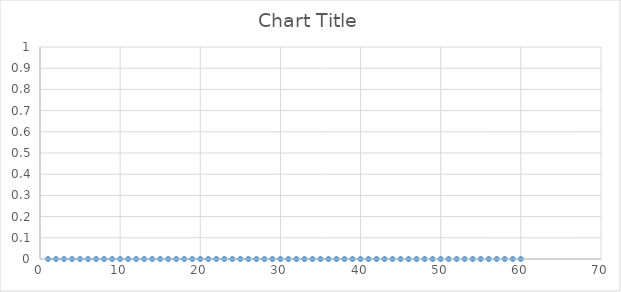
| Category | Series 0 |
|---|---|
| 0.0 | 0 |
| 0.0 | 0 |
| 0.0 | 0 |
| 0.0 | 0 |
| 0.0 | 0 |
| 0.0 | 0 |
| 0.0 | 0 |
| 0.0 | 0 |
| 0.0 | 0 |
| 0.0 | 0 |
| 0.0 | 0 |
| 0.0 | 0 |
| 0.0 | 0 |
| 0.0 | 0 |
| 0.0 | 0 |
| 0.0 | 0 |
| 0.0 | 0 |
| 0.0 | 0 |
| 0.0 | 0 |
| 0.0 | 0 |
| 0.0 | 0 |
| 0.0 | 0 |
| 0.0 | 0 |
| 0.0 | 0 |
| 0.0 | 0 |
| 0.0 | 0 |
| 0.0 | 0 |
| 0.0 | 0 |
| 0.0 | 0 |
| 0.0 | 0 |
| 0.0 | 0 |
| 0.0 | 0 |
| 0.0 | 0 |
| 0.0 | 0 |
| 0.0 | 0 |
| 0.0 | 0 |
| 0.0 | 0 |
| 0.0 | 0 |
| 0.0 | 0 |
| 0.0 | 0 |
| 0.0 | 0 |
| 0.0 | 0 |
| 0.0 | 0 |
| 0.0 | 0 |
| 0.0 | 0 |
| 0.0 | 0 |
| 0.0 | 0 |
| 0.0 | 0 |
| 0.0 | 0 |
| 0.0 | 0 |
| 0.0 | 0 |
| 0.0 | 0 |
| 0.0 | 0 |
| 0.0 | 0 |
| 0.0 | 0 |
| 0.0 | 0 |
| 0.0 | 0 |
| 0.0 | 0 |
| 0.0 | 0 |
| 0.0 | 0 |